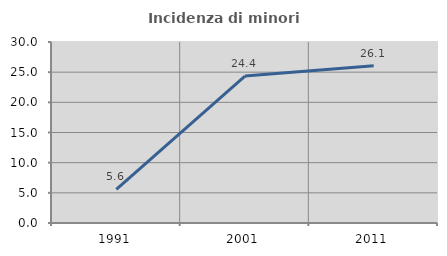
| Category | Incidenza di minori stranieri |
|---|---|
| 1991.0 | 5.556 |
| 2001.0 | 24.355 |
| 2011.0 | 26.07 |